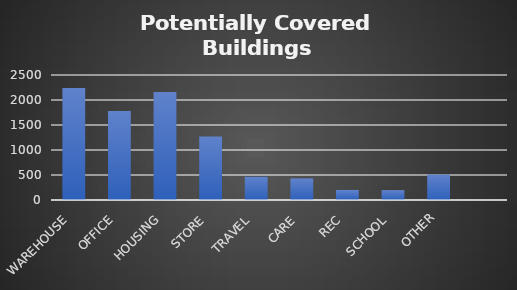
| Category | Covered Building Count |
|---|---|
| WAREHOUSE  | 2242 |
| OFFICE  | 1782 |
| HOUSING  | 2160 |
| STORE  | 1272 |
| TRAVEL  | 465 |
| CARE  | 433 |
| REC  | 201 |
| SCHOOL  | 198 |
| OTHER | 506 |